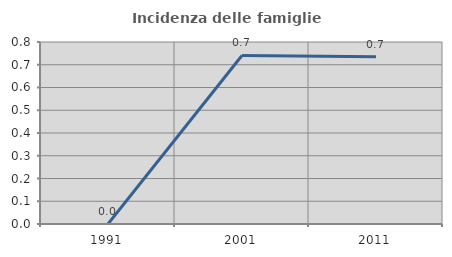
| Category | Incidenza delle famiglie numerose |
|---|---|
| 1991.0 | 0 |
| 2001.0 | 0.741 |
| 2011.0 | 0.735 |